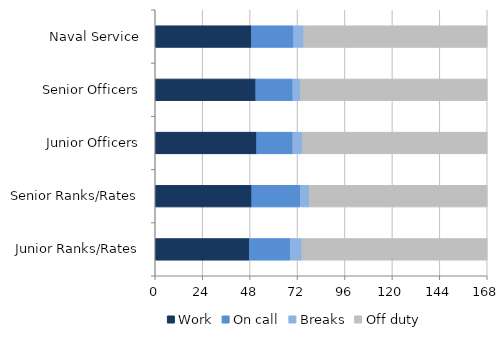
| Category | Work | On call | Breaks | Off duty |
|---|---|---|---|---|
| Naval Service | 48.666 | 21.331 | 5.176 | 92.795 |
| Senior Officers | 50.883 | 18.775 | 3.772 | 94.545 |
| Junior Officers | 51.315 | 18.312 | 4.897 | 93.447 |
| Senior Ranks/Rates | 48.842 | 24.608 | 4.557 | 89.954 |
| Junior Ranks/Rates | 47.668 | 20.699 | 5.847 | 93.755 |